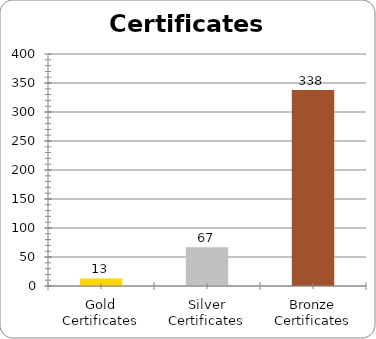
| Category | Series 0 |
|---|---|
| Gold Certificates | 13 |
| Silver Certificates | 67 |
| Bronze Certificates | 338 |